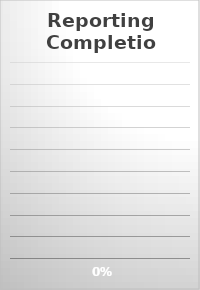
| Category | Series 0 |
|---|---|
| All Controls Reported: | 0 |